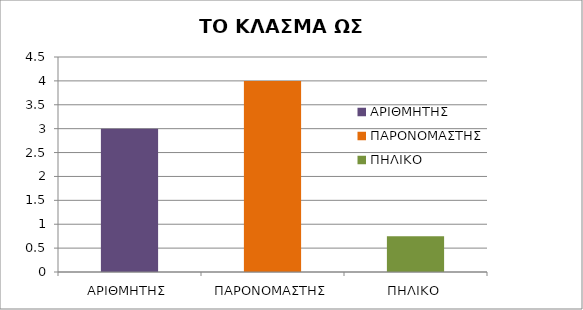
| Category | ΤΟ ΚΛΑΣΜΑ ΩΣ ΠΗΛΙΚΟ |
|---|---|
| ΑΡΙΘΜΗΤΗΣ | 3 |
| ΠΑΡΟΝΟΜΑΣΤΗΣ | 4 |
| ΠΗΛΙΚΟ | 0.75 |